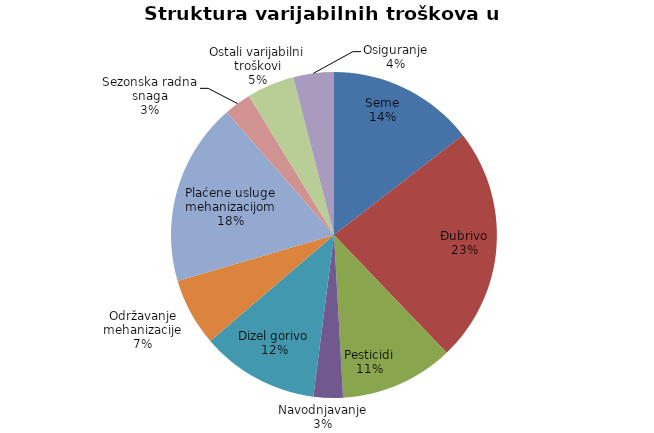
| Category | Series 0 |
|---|---|
| Seme | 10800 |
| Đubrivo | 17375 |
| Pesticidi | 8375 |
| Navodnjavanje | 2175 |
| Dizel gorivo | 8700 |
| Održavanje mehanizacije | 5000 |
| Plaćene usluge mehanizacijom | 13500 |
| Sezonska radna snaga | 2000 |
| Ostali varijabilni troškovi | 3500 |
| Osiguranje | 3000 |